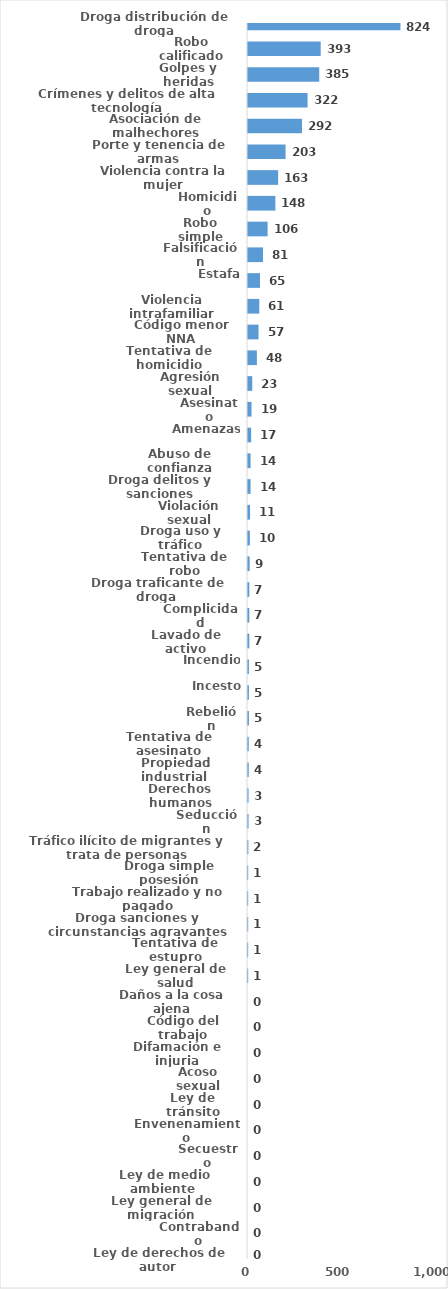
| Category | Series 0 |
|---|---|
| Droga distribución de droga | 824 |
| Robo calificado | 393 |
| Golpes y heridas | 385 |
| Crímenes y delitos de alta tecnología | 322 |
| Asociación de malhechores | 292 |
| Porte y tenencia de armas | 203 |
| Violencia contra la mujer | 163 |
| Homicidio | 148 |
| Robo simple | 106 |
| Falsificación | 81 |
| Estafa | 65 |
| Violencia intrafamiliar | 61 |
| Código menor NNA | 57 |
| Tentativa de homicidio | 48 |
| Agresión sexual | 23 |
| Asesinato | 19 |
| Amenazas | 17 |
| Abuso de confianza | 14 |
| Droga delitos y sanciones | 14 |
| Violación sexual | 11 |
| Droga uso y tráfico | 10 |
| Tentativa de robo | 9 |
| Droga traficante de droga  | 7 |
| Complicidad | 7 |
| Lavado de activo | 7 |
| Incendio | 5 |
| Incesto | 5 |
| Rebelión | 5 |
| Tentativa de asesinato | 4 |
| Propiedad industrial  | 4 |
| Derechos humanos | 3 |
| Seducción | 3 |
| Tráfico ilícito de migrantes y trata de personas | 2 |
| Droga simple posesión | 1 |
| Trabajo realizado y no pagado | 1 |
| Droga sanciones y circunstancias agravantes | 1 |
| Tentativa de estupro | 1 |
| Ley general de salud | 1 |
| Daños a la cosa ajena | 0 |
| Código del trabajo | 0 |
| Difamación e injuria | 0 |
| Acoso sexual | 0 |
| Ley de tránsito | 0 |
| Envenenamiento | 0 |
| Secuestro | 0 |
| Ley de medio ambiente  | 0 |
| Ley general de migración | 0 |
| Contrabando | 0 |
| Ley de derechos de autor  | 0 |